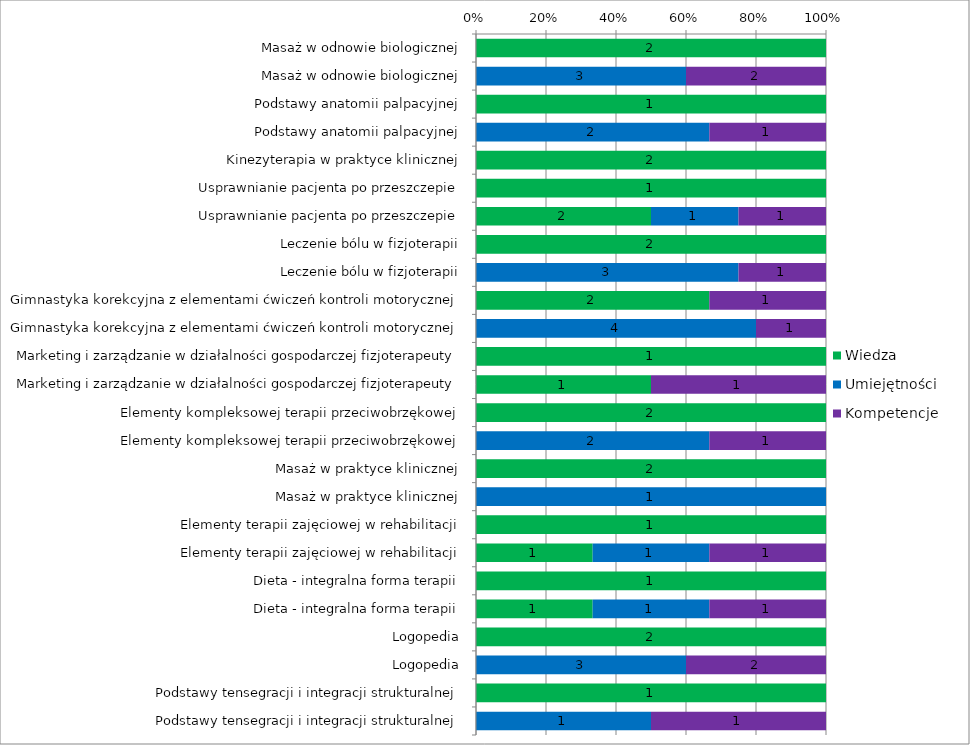
| Category | Wiedza | Umiejętności | Kompetencje |
|---|---|---|---|
| Masaż w odnowie biologicznej | 2 | 0 | 0 |
| Masaż w odnowie biologicznej | 0 | 3 | 2 |
| Podstawy anatomii palpacyjnej | 1 | 0 | 0 |
| Podstawy anatomii palpacyjnej | 0 | 2 | 1 |
| Kinezyterapia w praktyce klinicznej | 2 | 0 | 0 |
| Usprawnianie pacjenta po przeszczepie | 1 | 0 | 0 |
| Usprawnianie pacjenta po przeszczepie | 2 | 1 | 1 |
| Leczenie bólu w fizjoterapii | 2 | 0 | 0 |
| Leczenie bólu w fizjoterapii | 0 | 3 | 1 |
| Gimnastyka korekcyjna z elementami ćwiczeń kontroli motorycznej | 2 | 0 | 1 |
| Gimnastyka korekcyjna z elementami ćwiczeń kontroli motorycznej | 0 | 4 | 1 |
| Marketing i zarządzanie w działalności gospodarczej fizjoterapeuty | 1 | 0 | 0 |
| Marketing i zarządzanie w działalności gospodarczej fizjoterapeuty | 1 | 0 | 1 |
| Elementy kompleksowej terapii przeciwobrzękowej | 2 | 0 | 0 |
| Elementy kompleksowej terapii przeciwobrzękowej | 0 | 2 | 1 |
| Masaż w praktyce klinicznej | 2 | 0 | 0 |
| Masaż w praktyce klinicznej | 0 | 1 | 0 |
| Elementy terapii zajęciowej w rehabilitacji | 1 | 0 | 0 |
| Elementy terapii zajęciowej w rehabilitacji | 1 | 1 | 1 |
| Dieta - integralna forma terapii | 1 | 0 | 0 |
| Dieta - integralna forma terapii | 1 | 1 | 1 |
| Logopedia | 2 | 0 | 0 |
| Logopedia | 0 | 3 | 2 |
| Podstawy tensegracji i integracji strukturalnej | 1 | 0 | 0 |
| Podstawy tensegracji i integracji strukturalnej | 0 | 1 | 1 |